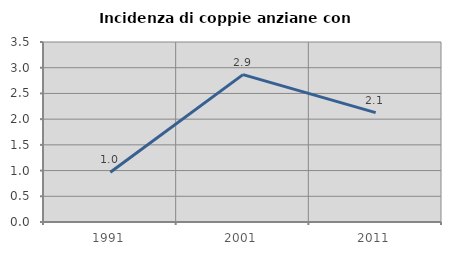
| Category | Incidenza di coppie anziane con figli |
|---|---|
| 1991.0 | 0.968 |
| 2001.0 | 2.866 |
| 2011.0 | 2.128 |